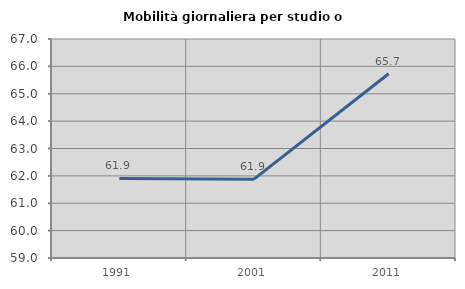
| Category | Mobilità giornaliera per studio o lavoro |
|---|---|
| 1991.0 | 61.909 |
| 2001.0 | 61.879 |
| 2011.0 | 65.731 |